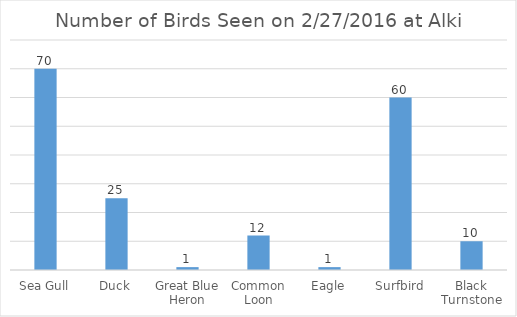
| Category | Number of Birds Seen on 2/27/2016 at Alki |
|---|---|
| Sea Gull | 70 |
| Duck | 25 |
| Great Blue Heron | 1 |
| Common Loon | 12 |
| Eagle | 1 |
| Surfbird | 60 |
| Black Turnstone | 10 |